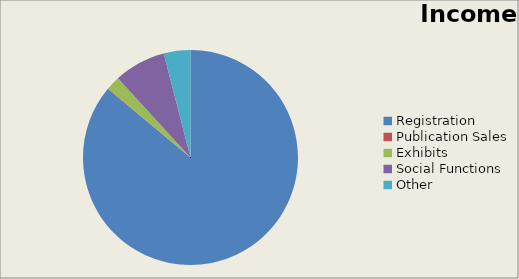
| Category | Income |
|---|---|
| Registration | 0.86 |
| Publication Sales | 0.001 |
| Exhibits | 0.021 |
| Social Functions | 0.078 |
| Other | 0.04 |